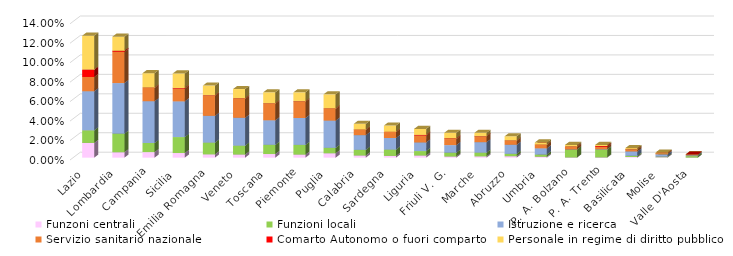
| Category | Funzoni centrali | Funzioni locali | Istruzione e ricerca | Servizio sanitario nazionale | Comarto Autonomo o fuori comparto | Personale in regime di diritto pubblico |
|---|---|---|---|---|---|---|
| Lazio | 0.015 | 0.013 | 0.04 | 0.015 | 0.008 | 0.035 |
| Lombardia | 0.006 | 0.019 | 0.052 | 0.032 | 0.001 | 0.014 |
| Campania | 0.006 | 0.009 | 0.043 | 0.014 | 0 | 0.015 |
| Sicilia | 0.005 | 0.016 | 0.037 | 0.013 | 0.001 | 0.015 |
| Emilia Romagna | 0.003 | 0.012 | 0.027 | 0.021 | 0 | 0.01 |
| Veneto | 0.003 | 0.009 | 0.029 | 0.02 | 0 | 0.01 |
| Toscana | 0.004 | 0.01 | 0.025 | 0.017 | 0 | 0.011 |
| Piemonte | 0.003 | 0.01 | 0.028 | 0.017 | 0 | 0.009 |
| Puglia | 0.005 | 0.006 | 0.028 | 0.012 | 0 | 0.015 |
| Calabria | 0.002 | 0.006 | 0.015 | 0.006 | 0 | 0.006 |
| Sardegna | 0.002 | 0.007 | 0.012 | 0.006 | 0 | 0.006 |
| Liguria | 0.002 | 0.005 | 0.009 | 0.007 | 0.001 | 0.006 |
| Friuli V. G. | 0.001 | 0.004 | 0.008 | 0.006 | 0.001 | 0.006 |
| Marche | 0.001 | 0.004 | 0.011 | 0.006 | 0 | 0.003 |
| Abruzzo | 0.002 | 0.002 | 0.009 | 0.004 | 0 | 0.004 |
| Umbria | 0.001 | 0.002 | 0.006 | 0.004 | 0 | 0.002 |
| P. A. Bolzano | 0 | 0.008 | 0 | 0.003 | 0 | 0.002 |
| P. A. Trento | 0 | 0.008 | 0 | 0.003 | 0.001 | 0.001 |
| Basilicata | 0.001 | 0.001 | 0.004 | 0.002 | 0 | 0.001 |
| Molise | 0 | 0.001 | 0.002 | 0.001 | 0 | 0.001 |
| Valle D'Aosta | 0 | 0.001 | 0.001 | 0.001 | 0 | 0 |